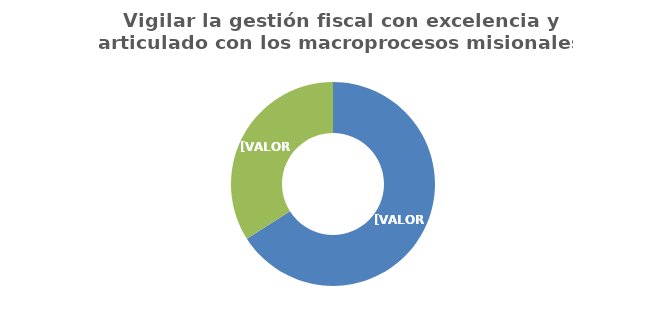
| Category | Vigilar la gestión fiscal con excelencia y articulado con los macroprocesos misionales |
|---|---|
| Avance 1° Semestre
(ejecución acumulada a junio de 2020) | 0.66 |
| Diferencia
(ejecución faltante para completar la meta establecida) | 0.34 |